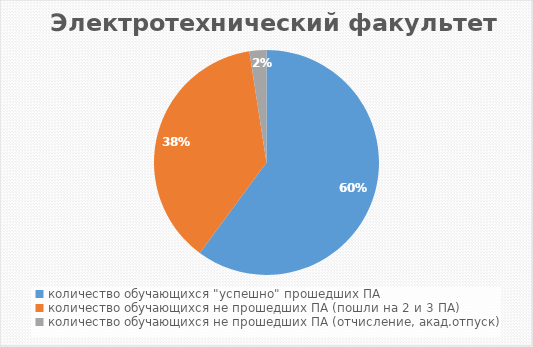
| Category | Электротехнический факультет |
|---|---|
| количество обучающихся "успешно" прошедших ПА | 443 |
| количество обучающихся не прошедших ПА (пошли на 2 и 3 ПА) | 276 |
| количество обучающихся не прошедших ПА (отчисление, акад.отпуск) | 18 |